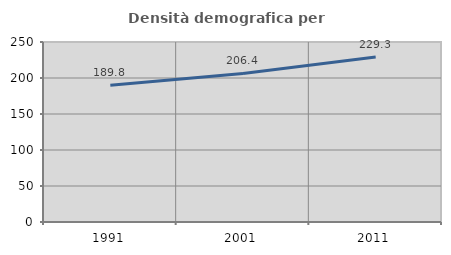
| Category | Densità demografica |
|---|---|
| 1991.0 | 189.819 |
| 2001.0 | 206.352 |
| 2011.0 | 229.313 |